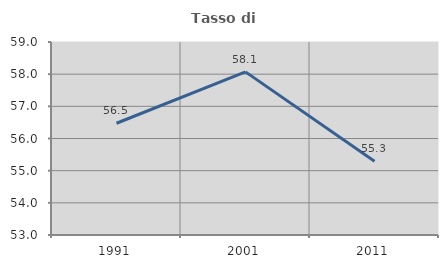
| Category | Tasso di occupazione   |
|---|---|
| 1991.0 | 56.474 |
| 2001.0 | 58.071 |
| 2011.0 | 55.291 |